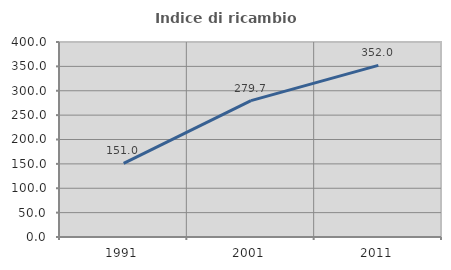
| Category | Indice di ricambio occupazionale  |
|---|---|
| 1991.0 | 151.007 |
| 2001.0 | 279.668 |
| 2011.0 | 352.049 |